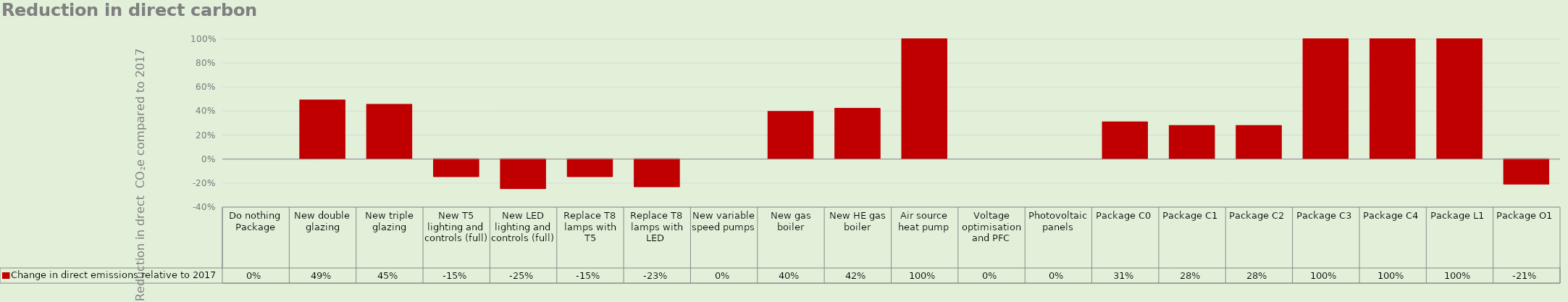
| Category | Change in direct emissions relative to 2017 |
|---|---|
| Do nothing Package | 0 |
| New double glazing | 0.49 |
| New triple glazing | 0.453 |
| New T5 lighting and controls (full) | -0.148 |
| New LED lighting and controls (full) | -0.248 |
| Replace T8 lamps with T5 | -0.148 |
| Replace T8 lamps with LED  | -0.233 |
| New variable speed pumps | 0 |
| New gas boiler | 0.395 |
| New HE gas boiler | 0.421 |
| Air source heat pump | 1 |
| Voltage optimisation and PFC | 0 |
| Photovoltaic panels | 0 |
| Package C0 | 0.308 |
| Package C1 | 0.278 |
| Package C2 | 0.278 |
| Package C3 | 1 |
| Package C4 | 1 |
| Package L1 | 1 |
| Package O1 | -0.209 |